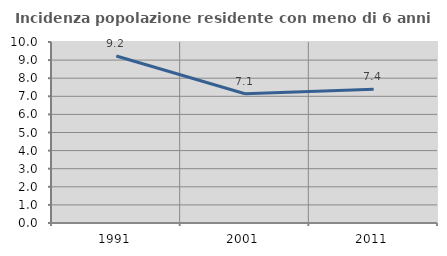
| Category | Incidenza popolazione residente con meno di 6 anni |
|---|---|
| 1991.0 | 9.227 |
| 2001.0 | 7.142 |
| 2011.0 | 7.393 |